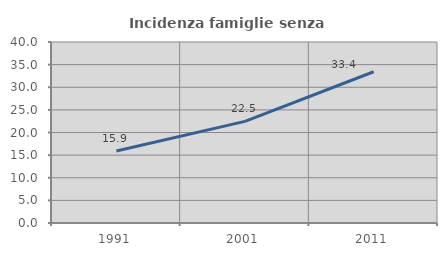
| Category | Incidenza famiglie senza nuclei |
|---|---|
| 1991.0 | 15.92 |
| 2001.0 | 22.464 |
| 2011.0 | 33.422 |